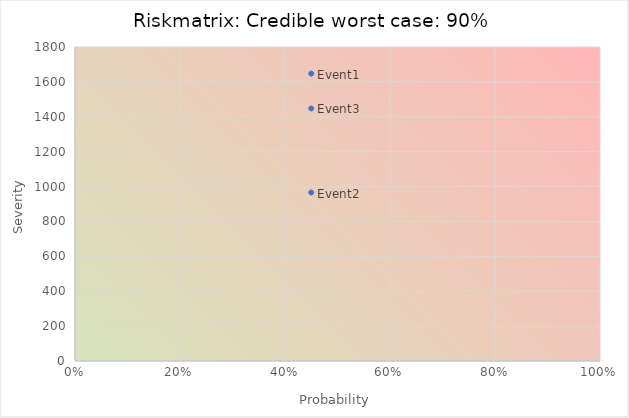
| Category | Severity |
|---|---|
| 0.45 | 1647.458 |
| 0.45 | 965.892 |
| 0.45 | 1447.993 |